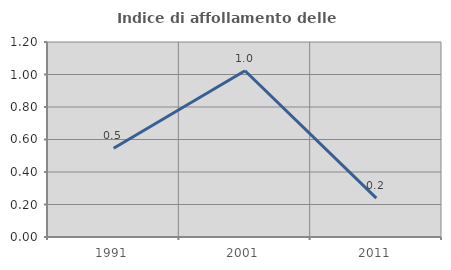
| Category | Indice di affollamento delle abitazioni  |
|---|---|
| 1991.0 | 0.546 |
| 2001.0 | 1.023 |
| 2011.0 | 0.24 |